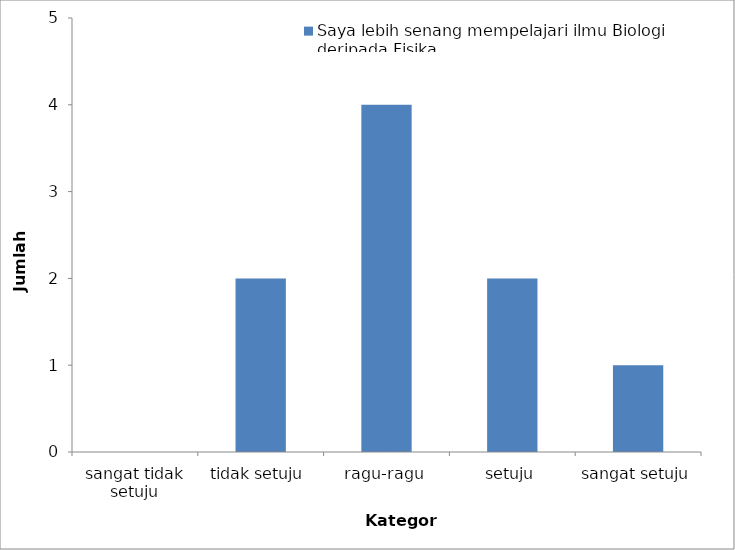
| Category | Saya lebih senang mempelajari ilmu Biologi deripada Fisika |
|---|---|
| sangat tidak setuju | 0 |
| tidak setuju | 2 |
| ragu-ragu | 4 |
| setuju | 2 |
| sangat setuju | 1 |